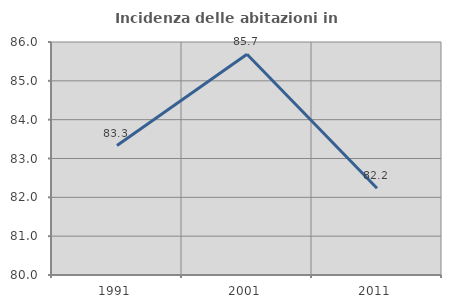
| Category | Incidenza delle abitazioni in proprietà  |
|---|---|
| 1991.0 | 83.333 |
| 2001.0 | 85.685 |
| 2011.0 | 82.236 |